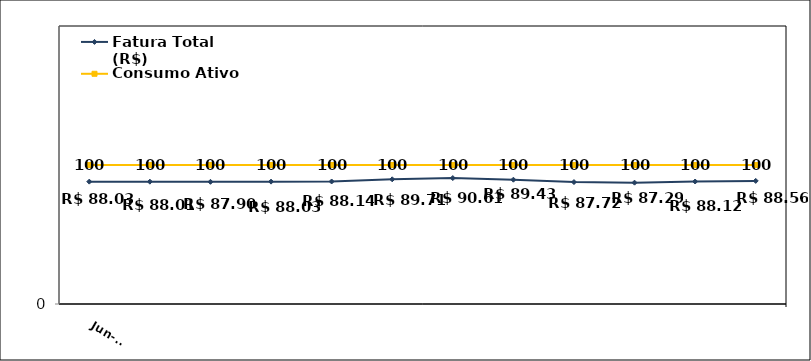
| Category | Fatura Total (R$) | Consumo Ativo (kWh) |
|---|---|---|
| 2023-06-01 | 88.03 | 100 |
| 2023-07-01 | 88.01 | 100 |
| 2023-08-01 | 87.9 | 100 |
| 2023-09-01 | 88.03 | 100 |
| 2023-10-01 | 88.14 | 100 |
| 2023-11-01 | 89.71 | 100 |
| 2023-12-01 | 90.61 | 100 |
| 2024-01-01 | 89.43 | 100 |
| 2024-02-01 | 87.72 | 100 |
| 2024-03-01 | 87.29 | 100 |
| 2024-04-01 | 88.12 | 100 |
| 2024-05-01 | 88.56 | 100 |